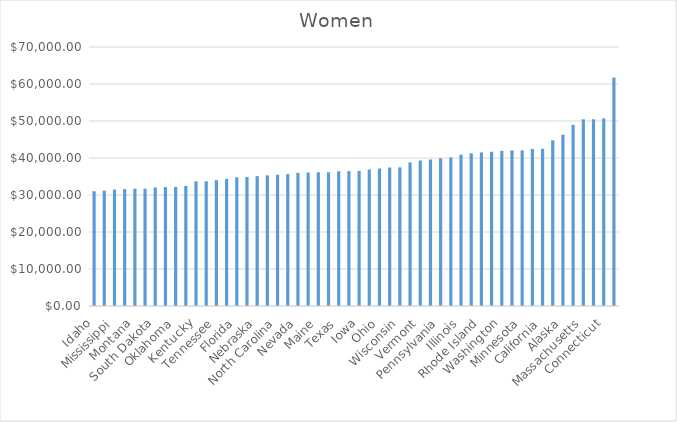
| Category | Women |
|---|---|
| Idaho | 31019 |
| Arkansas | 31161 |
| Mississippi | 31465 |
| Louisiana | 31586 |
| Montana | 31696 |
| West Virginia | 31712 |
| South Dakota | 32048 |
| Alabama | 32136 |
| Oklahoma | 32186 |
| New Mexico | 32473 |
| Kentucky | 33704 |
| South Carolina | 33719 |
| Tennessee | 34009 |
| Utah | 34351 |
| Florida | 34768 |
| Indiana | 34846 |
| Nebraska | 35101 |
| Missouri | 35311 |
| North Carolina | 35481 |
| Wyoming | 35652 |
| Nevada | 35993 |
| North Dakota | 36087 |
| Maine | 36137 |
| Kansas | 36162 |
| Texas | 36428 |
| Gerorgia | 36468 |
| Iowa | 36522 |
| Arizona | 36916 |
| Ohio | 37140 |
| Michigan | 37419 |
| Wisconsin | 37481 |
| Oregon | 38801 |
| Vermont | 39322 |
| United States | 39621 |
| Pennsylvania | 39905 |
| Hawaii | 40162 |
| Illinois | 40898 |
| Delaware | 41278 |
| Rhode Island | 41469 |
| Colorodo | 41690 |
| Washington | 41926 |
| New Hampshire | 42052 |
| Minnesota | 42066 |
| Virginia | 42445 |
| California | 42486 |
| New York | 44781 |
| Alaska | 46288 |
| New Jersey | 48943 |
| Massachusetts | 50459 |
| Maryland | 50481 |
| Connecticut | 50706 |
| District of Columbia | 61718 |